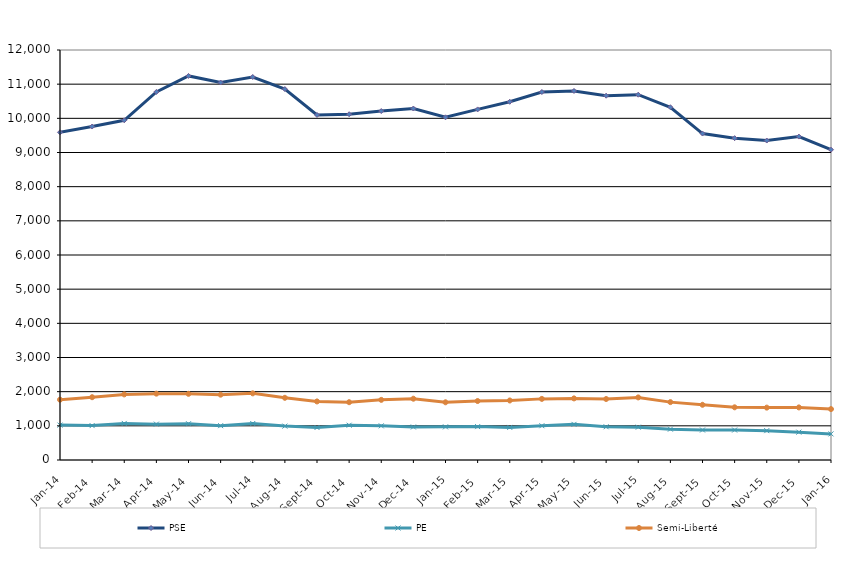
| Category | PSE | PE | Semi-Liberté |
|---|---|---|---|
| 2014-01-01 | 9591 | 1022 | 1765 |
| 2014-02-01 | 9760 | 1007 | 1838 |
| 2014-03-01 | 9943 | 1071 | 1920 |
| 2014-04-01 | 10773 | 1050 | 1942 |
| 2014-05-01 | 11241 | 1062 | 1937 |
| 2014-06-01 | 11048 | 1005 | 1912 |
| 2014-07-01 | 11210 | 1068 | 1951 |
| 2014-08-01 | 10856 | 992 | 1820 |
| 2014-09-01 | 10098 | 951 | 1714 |
| 2014-10-01 | 10120 | 1018 | 1692 |
| 2014-11-01 | 10213 | 1000 | 1760 |
| 2014-12-01 | 10287 | 966 | 1794 |
| 2015-01-01 | 10030 | 970 | 1689 |
| 2015-02-01 | 10261 | 977 | 1726 |
| 2015-03-01 | 10485 | 954 | 1742 |
| 2015-04-01 | 10770 | 1003 | 1789 |
| 2015-05-01 | 10801 | 1043 | 1803 |
| 2015-06-01 | 10662 | 973 | 1785 |
| 2015-07-01 | 10692 | 961 | 1832 |
| 2015-08-01 | 10325 | 903 | 1694 |
| 2015-09-01 | 9555 | 878 | 1616 |
| 2015-10-01 | 9420 | 877 | 1542 |
| 2015-11-01 | 9350 | 859 | 1533 |
| 2015-12-01 | 9466 | 815 | 1539 |
| 2016-01-01 | 9081 | 764 | 1490 |